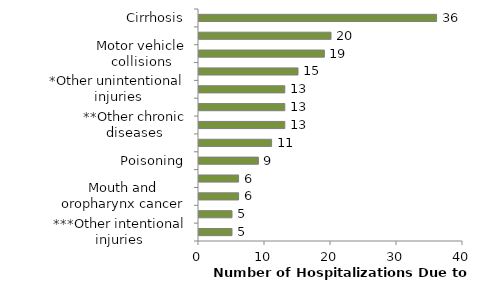
| Category | Series 0 |
|---|---|
| ***Other intentional injuries | 5 |
| Epilepsy | 5 |
| Mouth and oropharynx cancer | 6 |
| Alcoholic psychoses | 6 |
| Poisoning | 9 |
| Liver cancer | 11 |
| **Other chronic diseases | 13 |
| Alcohol dependence syndrome | 13 |
| *Other unintentional injuries | 13 |
| Breast cancer | 15 |
| Motor vehicle collisions | 19 |
| Self-inflicted harm | 20 |
| Cirrhosis | 36 |